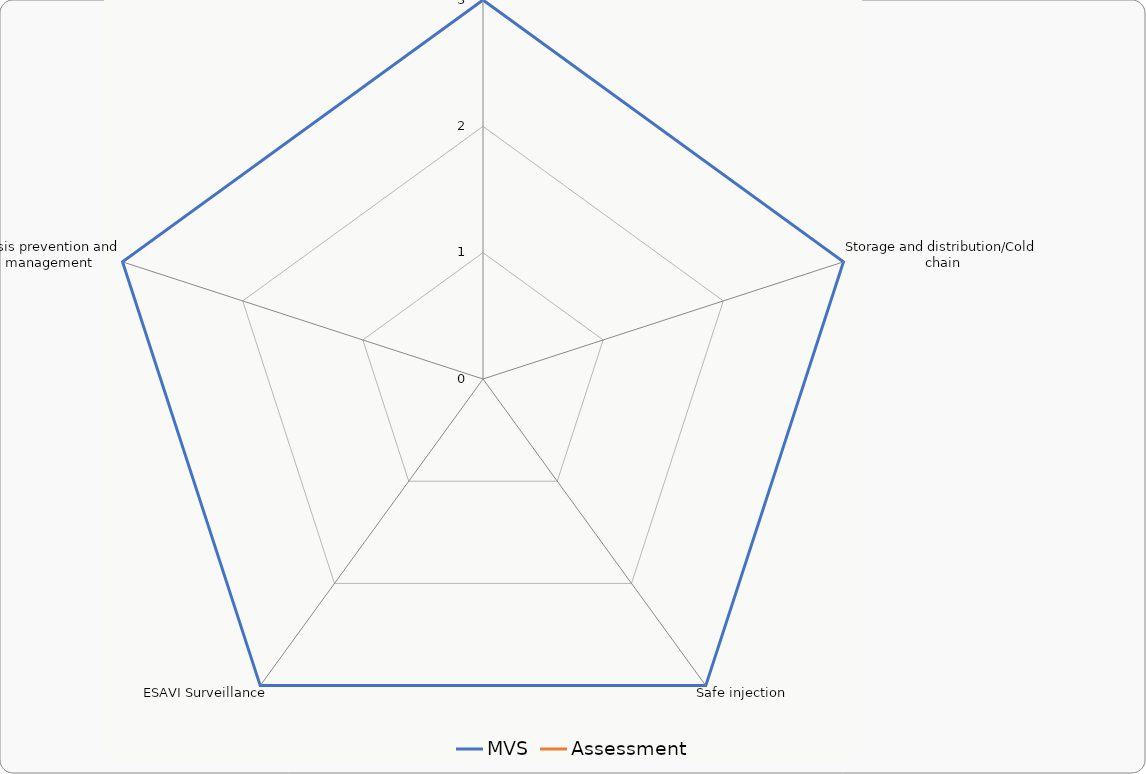
| Category | MVS | Assessment |
|---|---|---|
| Quality vaccines | 3 | 0 |
| Storage and distribution/Cold chain | 3 | 0 |
| Safe injection | 3 | 0 |
| ESAVI Surveillance | 3 | 0 |
| Crisis prevention and management | 3 | 0 |